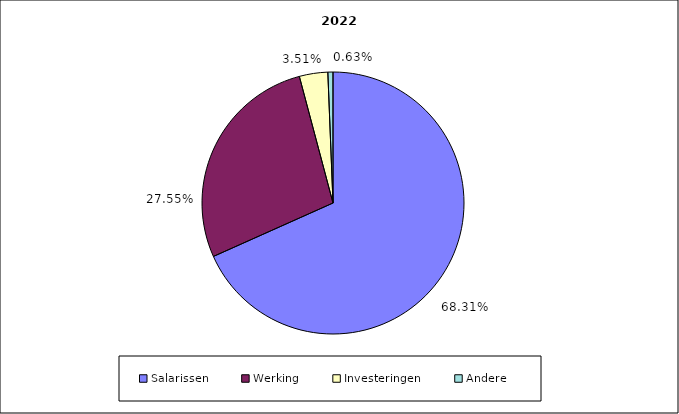
| Category | 2022 |
|---|---|
| Salarissen | 10009328.628 |
| Werking | 4037525.373 |
| Investeringen | 513900 |
| Andere | 92327.197 |